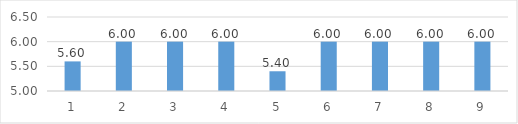
| Category | Series 0 |
|---|---|
| 0 | 5.6 |
| 1 | 6 |
| 2 | 6 |
| 3 | 6 |
| 4 | 5.4 |
| 5 | 6 |
| 6 | 6 |
| 7 | 6 |
| 8 | 6 |